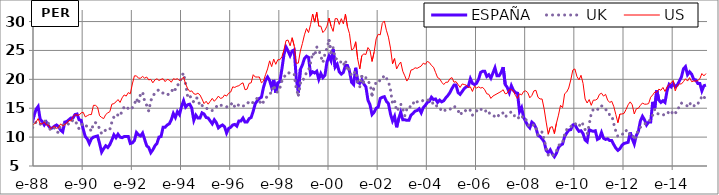
| Category | ESPAÑA | UK | US |
|---|---|---|---|
| 1987-03-01 | 16.3 | 16.4 | 16.1 |
| 1987-04-01 | 14.4 | 16.1 | 16.2 |
| 1987-05-01 | 14.1 | 16.7 | 15.8 |
| 1987-06-01 | 14.5 | 17.4 | 15.8 |
| 1987-07-01 | 16 | 17.3 | 16.6 |
| 1987-08-01 | 18 | 18.4 | 17.2 |
| 1987-09-01 | 19.1 | 17.7 | 17.6 |
| 1987-10-01 | 19.1 | 17.9 | 17 |
| 1987-11-01 | 14.4 | 13 | 13.3 |
| 1987-12-01 | 12.5 | 11.4 | 12.1 |
| 1988-01-01 | 13.7 | 12.2 | 12.2 |
| 1988-02-01 | 14.8 | 12.6 | 12.6 |
| 1988-03-01 | 15.3 | 12.6 | 13.2 |
| 1988-04-01 | 13.1 | 12.2 | 12.3 |
| 1988-05-01 | 12.7 | 12.6 | 12.3 |
| 1988-06-01 | 12.1 | 12.6 | 12.6 |
| 1988-07-01 | 12.6 | 13 | 12.1 |
| 1988-08-01 | 12 | 12.4 | 12.1 |
| 1988-09-01 | 11.5 | 11.2 | 11.5 |
| 1988-10-01 | 11.6 | 11.2 | 11.7 |
| 1988-11-01 | 11.9 | 11.6 | 11.9 |
| 1988-12-01 | 12.1 | 10.9 | 11.5 |
| 1989-01-01 | 11.8 | 10.8 | 11.7 |
| 1989-02-01 | 11.2 | 12.2 | 12.3 |
| 1989-03-01 | 10.9 | 12.1 | 11.9 |
| 1989-04-01 | 12.6 | 12.2 | 12.2 |
| 1989-05-01 | 12.7 | 12.5 | 12.4 |
| 1989-06-01 | 13 | 12.2 | 12.9 |
| 1989-07-01 | 13.3 | 12.4 | 12.8 |
| 1989-08-01 | 13.3 | 13 | 13.5 |
| 1989-09-01 | 13.9 | 12.9 | 13.9 |
| 1989-10-01 | 14 | 12.2 | 13.8 |
| 1989-11-01 | 13 | 11.4 | 13.8 |
| 1989-12-01 | 12.9 | 12 | 14.2 |
| 1990-01-01 | 11.4 | 12.4 | 14.3 |
| 1990-02-01 | 10.1 | 12.1 | 13.5 |
| 1990-03-01 | 9.7 | 11.8 | 13.7 |
| 1990-04-01 | 8.9 | 11.6 | 13.9 |
| 1990-05-01 | 9.7 | 11 | 13.9 |
| 1990-06-01 | 10 | 12.4 | 15.5 |
| 1990-07-01 | 10.1 | 12.5 | 15.5 |
| 1990-08-01 | 10.2 | 12.3 | 15.2 |
| 1990-09-01 | 8.9 | 11.4 | 13.7 |
| 1990-10-01 | 7.4 | 10.6 | 13.4 |
| 1990-11-01 | 8 | 10.7 | 13.2 |
| 1990-12-01 | 8.5 | 11.3 | 13.9 |
| 1991-01-01 | 8.2 | 11.2 | 14.2 |
| 1991-02-01 | 8.7 | 11.3 | 14.4 |
| 1991-03-01 | 9.5 | 12.6 | 15.7 |
| 1991-04-01 | 10.4 | 13.5 | 15.8 |
| 1991-05-01 | 9.9 | 14 | 16.1 |
| 1991-06-01 | 10.5 | 13.8 | 16.5 |
| 1991-07-01 | 10 | 13.6 | 16 |
| 1991-08-01 | 9.9 | 14.6 | 16.8 |
| 1991-09-01 | 10.1 | 15.2 | 17.3 |
| 1991-10-01 | 10.1 | 15.4 | 17.1 |
| 1991-11-01 | 10.1 | 14.9 | 17.7 |
| 1991-12-01 | 8.9 | 14.7 | 17.5 |
| 1992-01-01 | 9 | 15.1 | 19.2 |
| 1992-02-01 | 9.4 | 15.7 | 20.6 |
| 1992-03-01 | 10.8 | 16.7 | 20.6 |
| 1992-04-01 | 10.4 | 15.8 | 20.2 |
| 1992-05-01 | 10.2 | 17.5 | 20.2 |
| 1992-06-01 | 10.7 | 17.8 | 20.5 |
| 1992-07-01 | 9.6 | 16.2 | 20.2 |
| 1992-08-01 | 8.5 | 15.5 | 20.4 |
| 1992-09-01 | 8.2 | 14.5 | 19.9 |
| 1992-10-01 | 7.3 | 16.3 | 20 |
| 1992-11-01 | 7.8 | 17.1 | 19.4 |
| 1992-12-01 | 8.5 | 17.6 | 19.9 |
| 1993-01-01 | 8.9 | 18 | 20.1 |
| 1993-02-01 | 10 | 18.2 | 19.8 |
| 1993-03-01 | 10.1 | 17.9 | 20 |
| 1993-04-01 | 11.7 | 17.6 | 20.1 |
| 1993-05-01 | 11.7 | 17.3 | 19.6 |
| 1993-06-01 | 12.1 | 17.3 | 20 |
| 1993-07-01 | 12.3 | 17.5 | 19.9 |
| 1993-08-01 | 13 | 17.7 | 19.5 |
| 1993-09-01 | 14.1 | 18.6 | 20.1 |
| 1993-10-01 | 13.4 | 18.2 | 20 |
| 1993-11-01 | 14.4 | 19 | 20.1 |
| 1993-12-01 | 13.9 | 19.2 | 19.8 |
| 1994-01-01 | 15.3 | 20.5 | 20 |
| 1994-02-01 | 16.3 | 21.1 | 20.4 |
| 1994-03-01 | 15.2 | 19.2 | 19.2 |
| 1994-04-01 | 15.6 | 17 | 18.4 |
| 1994-05-01 | 15.7 | 17.3 | 17.9 |
| 1994-06-01 | 15 | 16.3 | 18 |
| 1994-07-01 | 12.9 | 16.1 | 17.5 |
| 1994-08-01 | 13.8 | 16.8 | 17.4 |
| 1994-09-01 | 13.3 | 16.7 | 17.6 |
| 1994-10-01 | 13.3 | 15.3 | 17.3 |
| 1994-11-01 | 14.2 | 15.5 | 16.6 |
| 1994-12-01 | 14 | 15.1 | 15.8 |
| 1995-01-01 | 13.4 | 15.1 | 16.2 |
| 1995-02-01 | 13.3 | 14.7 | 15.7 |
| 1995-03-01 | 12.8 | 14.6 | 16.2 |
| 1995-04-01 | 12.3 | 14.6 | 16.7 |
| 1995-05-01 | 13 | 14.9 | 16.2 |
| 1995-06-01 | 12.5 | 15.3 | 16.6 |
| 1995-07-01 | 11.6 | 15.1 | 17.1 |
| 1995-08-01 | 11.9 | 15.5 | 16.7 |
| 1995-09-01 | 12.1 | 15.5 | 16.8 |
| 1995-10-01 | 11.8 | 15.3 | 17.3 |
| 1995-11-01 | 10.7 | 15.2 | 17.1 |
| 1995-12-01 | 11.5 | 15.6 | 17.6 |
| 1996-01-01 | 11.7 | 15.6 | 17.8 |
| 1996-02-01 | 12.1 | 16 | 18.7 |
| 1996-03-01 | 12.2 | 15.2 | 18.6 |
| 1996-04-01 | 11.9 | 15.1 | 18.8 |
| 1996-05-01 | 12.8 | 15.7 | 18.9 |
| 1996-06-01 | 12.8 | 15.6 | 19.2 |
| 1996-07-01 | 13.3 | 15.4 | 19.4 |
| 1996-08-01 | 12.6 | 15.4 | 18.2 |
| 1996-09-01 | 12.6 | 15.7 | 18.3 |
| 1996-10-01 | 13.2 | 16.2 | 19.3 |
| 1996-11-01 | 13.4 | 15.9 | 19.4 |
| 1996-12-01 | 14.5 | 16 | 20.8 |
| 1997-01-01 | 15.8 | 16.2 | 20.4 |
| 1997-02-01 | 16.3 | 16.8 | 20.4 |
| 1997-03-01 | 16.7 | 16.3 | 20.4 |
| 1997-04-01 | 16.9 | 15.6 | 19.4 |
| 1997-05-01 | 18.6 | 16.1 | 19.7 |
| 1997-06-01 | 19.8 | 16.7 | 20.8 |
| 1997-07-01 | 20.4 | 17.1 | 21.8 |
| 1997-08-01 | 19.8 | 17.6 | 23.2 |
| 1997-09-01 | 18.6 | 17.6 | 22.2 |
| 1997-10-01 | 19.9 | 19 | 23.5 |
| 1997-11-01 | 17.7 | 17.8 | 22.6 |
| 1997-12-01 | 19.4 | 17.8 | 23.4 |
| 1998-01-01 | 19.6 | 18.5 | 23.4 |
| 1998-02-01 | 21.8 | 19.7 | 23.9 |
| 1998-03-01 | 24.3 | 20.4 | 25.1 |
| 1998-04-01 | 25.6 | 20.8 | 26.7 |
| 1998-05-01 | 24.9 | 21.2 | 26.8 |
| 1998-06-01 | 24.1 | 21 | 25.8 |
| 1998-07-01 | 24.9 | 21 | 27.2 |
| 1998-08-01 | 25.1 | 20.9 | 25.8 |
| 1998-09-01 | 20.2 | 18.3 | 22.8 |
| 1998-10-01 | 17.7 | 17.3 | 22.8 |
| 1998-11-01 | 21.7 | 19.4 | 24.9 |
| 1998-12-01 | 22.5 | 19.4 | 26.2 |
| 1999-01-01 | 23.6 | 20.6 | 27.7 |
| 1999-02-01 | 24 | 21.1 | 28.8 |
| 1999-03-01 | 23.8 | 21.5 | 28.1 |
| 1999-04-01 | 20.9 | 22.9 | 29.5 |
| 1999-05-01 | 21.3 | 24.6 | 31.3 |
| 1999-06-01 | 21.1 | 24 | 29.9 |
| 1999-07-01 | 21.4 | 25.6 | 31.6 |
| 1999-08-01 | 20 | 25.1 | 29.2 |
| 1999-09-01 | 21 | 24 | 29.2 |
| 1999-10-01 | 20.3 | 22.9 | 28.1 |
| 1999-11-01 | 20.7 | 24.4 | 28.5 |
| 1999-12-01 | 23 | 25.4 | 29.2 |
| 2000-01-01 | 24 | 26.7 | 30.6 |
| 2000-02-01 | 23.2 | 24.6 | 29.2 |
| 2000-03-01 | 25.2 | 25.5 | 28.3 |
| 2000-04-01 | 22.1 | 23.6 | 30.5 |
| 2000-05-01 | 22.6 | 23.5 | 30.5 |
| 2000-06-01 | 21.3 | 23 | 29.5 |
| 2000-07-01 | 20.9 | 23 | 30.5 |
| 2000-08-01 | 21.2 | 22.4 | 29.6 |
| 2000-09-01 | 22.4 | 23.3 | 31.3 |
| 2000-10-01 | 22.4 | 21.4 | 29.1 |
| 2000-11-01 | 21.4 | 21.8 | 27.9 |
| 2000-12-01 | 19.5 | 20.6 | 25.1 |
| 2001-01-01 | 19.1 | 21 | 25.3 |
| 2001-02-01 | 22 | 21.4 | 26.5 |
| 2001-03-01 | 19.5 | 19.5 | 23.5 |
| 2001-04-01 | 19.3 | 18.7 | 21.8 |
| 2001-05-01 | 19.9 | 20.5 | 24.1 |
| 2001-06-01 | 19.2 | 19.4 | 24.4 |
| 2001-07-01 | 18.7 | 20.3 | 24.3 |
| 2001-08-01 | 16.4 | 19.6 | 25.5 |
| 2001-09-01 | 15.6 | 19.3 | 25 |
| 2001-10-01 | 13.9 | 17.3 | 23.1 |
| 2001-11-01 | 14.3 | 18.6 | 24.7 |
| 2001-12-01 | 15 | 19.5 | 27 |
| 2002-01-01 | 15.2 | 19.9 | 27.8 |
| 2002-02-01 | 16.7 | 19.7 | 27.7 |
| 2002-03-01 | 16.9 | 20.1 | 29.7 |
| 2002-04-01 | 17 | 20.7 | 30.1 |
| 2002-05-01 | 16.2 | 20.2 | 28.5 |
| 2002-06-01 | 15.8 | 19.6 | 27.3 |
| 2002-07-01 | 14 | 18.2 | 25.4 |
| 2002-08-01 | 12.8 | 15.8 | 22.7 |
| 2002-09-01 | 13.6 | 16.3 | 23.6 |
| 2002-10-01 | 11.7 | 14.5 | 21.8 |
| 2002-11-01 | 13.2 | 15 | 22.5 |
| 2002-12-01 | 14.3 | 15.7 | 23 |
| 2003-01-01 | 13 | 14.9 | 21.4 |
| 2003-02-01 | 13 | 13.7 | 20.6 |
| 2003-03-01 | 12.9 | 14.9 | 19.7 |
| 2003-04-01 | 12.9 | 14.8 | 20.3 |
| 2003-05-01 | 13.8 | 15.6 | 21.6 |
| 2003-06-01 | 14.1 | 16 | 21.7 |
| 2003-07-01 | 14.5 | 15.6 | 22 |
| 2003-08-01 | 14.6 | 16.1 | 21.9 |
| 2003-09-01 | 14.9 | 16.2 | 22.1 |
| 2003-10-01 | 14.2 | 16.1 | 22.3 |
| 2003-11-01 | 15.1 | 16.4 | 22.8 |
| 2003-12-01 | 15.5 | 16.4 | 22.6 |
| 2004-01-01 | 16 | 16.5 | 23.1 |
| 2004-02-01 | 16.2 | 16.3 | 22.9 |
| 2004-03-01 | 16.9 | 16.3 | 22.4 |
| 2004-04-01 | 16.5 | 15.6 | 22.1 |
| 2004-05-01 | 16.6 | 15.7 | 21.2 |
| 2004-06-01 | 16 | 15.1 | 20.3 |
| 2004-07-01 | 16.4 | 15.1 | 20.1 |
| 2004-08-01 | 16.1 | 14.5 | 19.5 |
| 2004-09-01 | 16.3 | 14.4 | 19.1 |
| 2004-10-01 | 16.8 | 14.8 | 19.5 |
| 2004-11-01 | 17.2 | 14.7 | 19.5 |
| 2004-12-01 | 17.7 | 14.8 | 20.1 |
| 2005-01-01 | 18.4 | 15.1 | 20.3 |
| 2005-02-01 | 19 | 15.4 | 19.5 |
| 2005-03-01 | 19 | 15 | 19.6 |
| 2005-04-01 | 17.7 | 14.6 | 19.1 |
| 2005-05-01 | 17.4 | 13.8 | 18.6 |
| 2005-06-01 | 17.9 | 14.3 | 19.2 |
| 2005-07-01 | 18.4 | 14.7 | 19.1 |
| 2005-08-01 | 18.7 | 14.5 | 19 |
| 2005-09-01 | 18.8 | 14.3 | 18.6 |
| 2005-10-01 | 20.1 | 14.7 | 18.7 |
| 2005-11-01 | 19.3 | 13.8 | 17.9 |
| 2005-12-01 | 19.1 | 14.1 | 18.8 |
| 2006-01-01 | 19.3 | 14.5 | 18.5 |
| 2006-02-01 | 20 | 15 | 18.7 |
| 2006-03-01 | 21.2 | 14.8 | 18.5 |
| 2006-04-01 | 21.4 | 14.8 | 18.6 |
| 2006-05-01 | 21.4 | 14.9 | 18.2 |
| 2006-06-01 | 20.5 | 14.1 | 17.5 |
| 2006-07-01 | 20.8 | 14.3 | 17.4 |
| 2006-08-01 | 20.2 | 13.8 | 16.7 |
| 2006-09-01 | 21.1 | 13.7 | 17.1 |
| 2006-10-01 | 22 | 13.6 | 17.3 |
| 2006-11-01 | 20.6 | 14 | 17.5 |
| 2006-12-01 | 20.6 | 13.6 | 17.7 |
| 2007-01-01 | 21.2 | 14 | 17.9 |
| 2007-02-01 | 22.1 | 14.2 | 18.2 |
| 2007-03-01 | 19.1 | 13.5 | 17.5 |
| 2007-04-01 | 18.6 | 13.8 | 17.6 |
| 2007-05-01 | 17.7 | 14.1 | 18.2 |
| 2007-06-01 | 18.9 | 14.4 | 18.2 |
| 2007-07-01 | 18.1 | 14.1 | 18 |
| 2007-08-01 | 17.7 | 13.3 | 17.2 |
| 2007-09-01 | 17.6 | 13.2 | 16.7 |
| 2007-10-01 | 14.4 | 13.5 | 17.5 |
| 2007-11-01 | 15.1 | 13.8 | 17.3 |
| 2007-12-01 | 13.4 | 13.1 | 17.9 |
| 2008-01-01 | 12.7 | 13.2 | 18 |
| 2008-02-01 | 12 | 12.2 | 17.7 |
| 2008-03-01 | 11.6 | 11.8 | 16.8 |
| 2008-04-01 | 12.6 | 11.8 | 17.2 |
| 2008-05-01 | 12.3 | 12.2 | 18 |
| 2008-06-01 | 11.6 | 11.6 | 18.1 |
| 2008-07-01 | 10.3 | 10.4 | 16.9 |
| 2008-08-01 | 10.1 | 10.3 | 16.6 |
| 2008-09-01 | 9.7 | 10.9 | 16.6 |
| 2008-10-01 | 9.2 | 9.6 | 14.9 |
| 2008-11-01 | 7.7 | 8.1 | 12.6 |
| 2008-12-01 | 7.3 | 6.9 | 10.5 |
| 2009-01-01 | 7.8 | 7.1 | 11.7 |
| 2009-02-01 | 7.1 | 6.8 | 11.8 |
| 2009-03-01 | 6.6 | 7 | 10.6 |
| 2009-04-01 | 7.2 | 7.6 | 12.4 |
| 2009-05-01 | 8.2 | 8.5 | 13.8 |
| 2009-06-01 | 8.6 | 8.9 | 15.5 |
| 2009-07-01 | 8.8 | 9 | 15.1 |
| 2009-08-01 | 10.1 | 10.5 | 17.5 |
| 2009-09-01 | 10.7 | 11.3 | 17.8 |
| 2009-10-01 | 11.2 | 11.8 | 18.5 |
| 2009-11-01 | 11.3 | 11.8 | 19.9 |
| 2009-12-01 | 12.1 | 12.2 | 21.6 |
| 2010-01-01 | 12.2 | 12.4 | 21.8 |
| 2010-02-01 | 11.5 | 12 | 20.5 |
| 2010-03-01 | 11 | 11.8 | 19.9 |
| 2010-04-01 | 11.1 | 12.6 | 20.7 |
| 2010-05-01 | 10.6 | 12.2 | 19.3 |
| 2010-06-01 | 9.5 | 11.3 | 16.6 |
| 2010-07-01 | 9.2 | 10.5 | 15.9 |
| 2010-08-01 | 11.3 | 12.2 | 16.5 |
| 2010-09-01 | 11.1 | 14.1 | 15.5 |
| 2010-10-01 | 11 | 14.8 | 16.4 |
| 2010-11-01 | 11.1 | 14.9 | 16.4 |
| 2010-12-01 | 9.6 | 14.7 | 16.6 |
| 2011-01-01 | 9.8 | 15.4 | 17.4 |
| 2011-02-01 | 10.8 | 15.4 | 17.6 |
| 2011-03-01 | 9.8 | 15.3 | 17.1 |
| 2011-04-01 | 9.6 | 14.9 | 17.4 |
| 2011-05-01 | 9.7 | 14.1 | 16.4 |
| 2011-06-01 | 9.4 | 13.9 | 16 |
| 2011-07-01 | 9.4 | 13.8 | 16.2 |
| 2011-08-01 | 8.7 | 12.3 | 15.3 |
| 2011-09-01 | 8.1 | 11 | 13.9 |
| 2011-10-01 | 7.7 | 10.1 | 12.5 |
| 2011-11-01 | 8 | 10.4 | 14 |
| 2011-12-01 | 8.6 | 10.5 | 14 |
| 2012-01-01 | 8.9 | 10.6 | 14.1 |
| 2012-02-01 | 9 | 11.2 | 14.8 |
| 2012-03-01 | 9.1 | 10.4 | 15.6 |
| 2012-04-01 | 10.8 | 10.6 | 16.1 |
| 2012-05-01 | 9.7 | 10.6 | 15.6 |
| 2012-06-01 | 8.8 | 9.5 | 14 |
| 2012-07-01 | 10.3 | 10.2 | 14.9 |
| 2012-08-01 | 11 | 11.4 | 15 |
| 2012-09-01 | 12.8 | 11.7 | 15.5 |
| 2012-10-01 | 13.6 | 11.9 | 15.9 |
| 2012-11-01 | 13 | 12.3 | 15.7 |
| 2012-12-01 | 12.1 | 12.4 | 15.7 |
| 2013-01-01 | 12.6 | 12.5 | 15.8 |
| 2013-02-01 | 12.6 | 13.3 | 16.9 |
| 2013-03-01 | 16.1 | 13.8 | 17.3 |
| 2013-04-01 | 15 | 14.8 | 17.8 |
| 2013-05-01 | 18.1 | 14.1 | 17.8 |
| 2013-06-01 | 16.4 | 14 | 18.3 |
| 2013-07-01 | 16 | 13.8 | 18.1 |
| 2013-08-01 | 16.3 | 13.8 | 18.6 |
| 2013-09-01 | 16 | 14 | 17.9 |
| 2013-10-01 | 18 | 13.9 | 18.7 |
| 2013-11-01 | 19.1 | 14.5 | 19.1 |
| 2013-12-01 | 18.7 | 14.1 | 19.4 |
| 2014-01-01 | 19.3 | 14.4 | 19.8 |
| 2014-02-01 | 18.7 | 14 | 18 |
| 2014-03-01 | 19 | 15 | 18.9 |
| 2014-04-01 | 19.7 | 15.1 | 19.2 |
| 2014-05-01 | 20.4 | 15.9 | 19.2 |
| 2014-06-01 | 21.8 | 15.7 | 19.6 |
| 2014-07-01 | 22.2 | 15.5 | 20.1 |
| 2014-08-01 | 20.8 | 15.4 | 19.7 |
| 2014-09-01 | 21.3 | 16 | 20.3 |
| 2014-10-01 | 20.9 | 15.3 | 19.6 |
| 2014-11-01 | 20 | 15.3 | 19.7 |
| 2014-12-01 | 19.9 | 15.9 | 19.7 |
| 2015-01-01 | 19.3 | 15.8 | 19.8 |
| 2015-02-01 | 19.3 | 16.2 | 20.1 |
| 2015-03-01 | 18 | 17.1 | 21 |
| 2015-04-01 | 18.9 | 16.7 | 20.6 |
| 2015-05-01 | 19 | 17.3 | 21 |